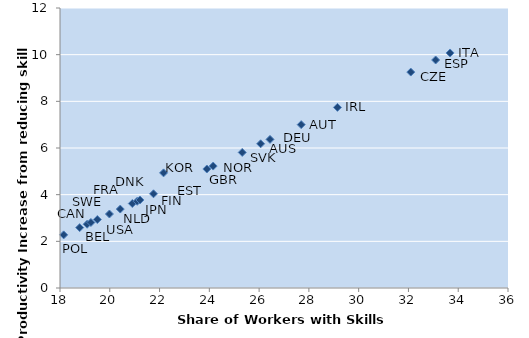
| Category | Series 0 |
|---|---|
| 18.14687 | 2.277 |
| 18.78951 | 2.588 |
| 19.08922 | 2.734 |
| 19.24217 | 2.808 |
| 19.49958 | 2.934 |
| 19.98667 | 3.171 |
| 20.42065 | 3.383 |
| 20.90489 | 3.62 |
| 21.10233 | 3.717 |
| 21.21339 | 3.772 |
| 21.75699 | 4.039 |
| 22.16202 | 4.935 |
| 23.90118 | 5.1 |
| 24.15457 | 5.226 |
| 25.32187 | 5.809 |
| 26.06149 | 6.179 |
| 26.43803 | 6.369 |
| 27.6902 | 7.001 |
| 29.14666 | 7.741 |
| 32.09473 | 9.254 |
| 33.09386 | 9.772 |
| 33.67262 | 10.073 |